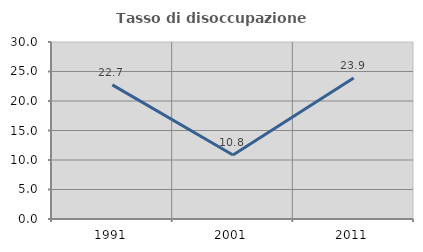
| Category | Tasso di disoccupazione giovanile  |
|---|---|
| 1991.0 | 22.727 |
| 2001.0 | 10.843 |
| 2011.0 | 23.881 |